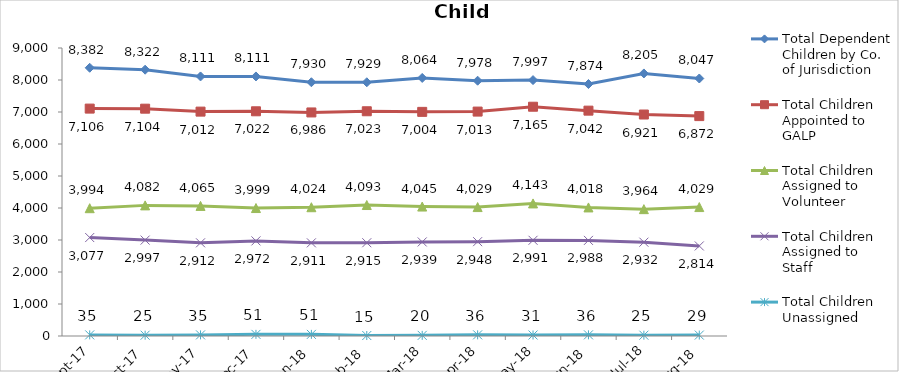
| Category | Total Dependent Children by Co. of Jurisdiction | Total Children Appointed to GALP | Total Children Assigned to Volunteer | Total Children Assigned to Staff | Total Children Unassigned |
|---|---|---|---|---|---|
| 2017-09-01 | 8382 | 7106 | 3994 | 3077 | 35 |
| 2017-10-01 | 8322 | 7104 | 4082 | 2997 | 25 |
| 2017-11-01 | 8111 | 7012 | 4065 | 2912 | 35 |
| 2017-12-01 | 8111 | 7022 | 3999 | 2972 | 51 |
| 2018-01-01 | 7930 | 6986 | 4024 | 2911 | 51 |
| 2018-02-01 | 7929 | 7023 | 4093 | 2915 | 15 |
| 2018-03-01 | 8064 | 7004 | 4045 | 2939 | 20 |
| 2018-04-01 | 7978 | 7013 | 4029 | 2948 | 36 |
| 2018-05-01 | 7997 | 7165 | 4143 | 2991 | 31 |
| 2018-06-01 | 7874 | 7042 | 4018 | 2988 | 36 |
| 2018-07-01 | 8205 | 6921 | 3964 | 2932 | 25 |
| 2018-08-01 | 8047 | 6872 | 4029 | 2814 | 29 |